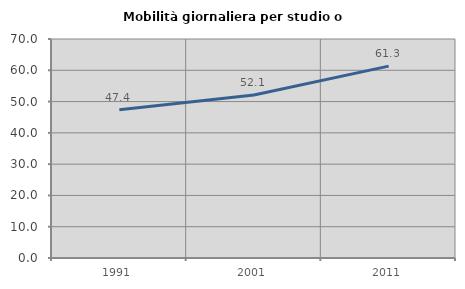
| Category | Mobilità giornaliera per studio o lavoro |
|---|---|
| 1991.0 | 47.368 |
| 2001.0 | 52.083 |
| 2011.0 | 61.333 |